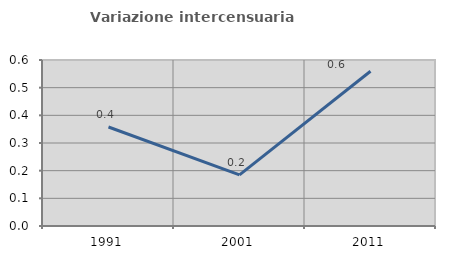
| Category | Variazione intercensuaria annua |
|---|---|
| 1991.0 | 0.358 |
| 2001.0 | 0.185 |
| 2011.0 | 0.559 |